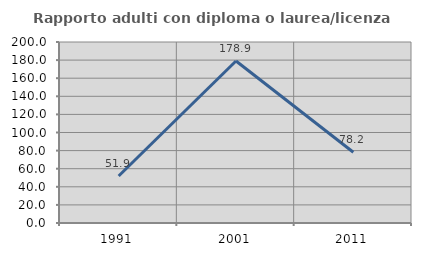
| Category | Rapporto adulti con diploma o laurea/licenza media  |
|---|---|
| 1991.0 | 51.942 |
| 2001.0 | 178.947 |
| 2011.0 | 78.212 |